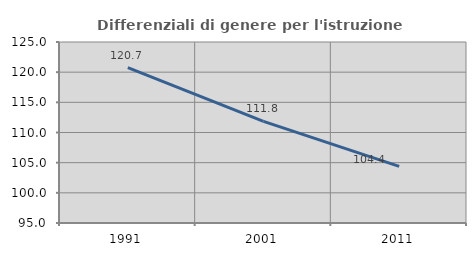
| Category | Differenziali di genere per l'istruzione superiore |
|---|---|
| 1991.0 | 120.741 |
| 2001.0 | 111.844 |
| 2011.0 | 104.377 |